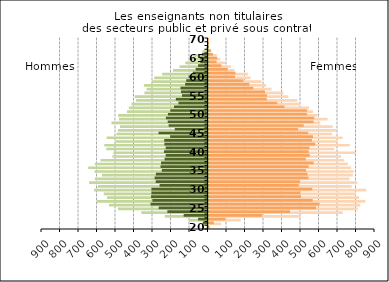
| Category | Femmes public | Femmes privé |
|---|---|---|
| 20.0 | 10 | 2 |
| 21.0 | 68 | 29 |
| 22.0 | 174 | 91 |
| 23.0 | 499 | 290 |
| 24.0 | 725 | 441 |
| 25.0 | 806 | 582 |
| 26.0 | 820 | 600 |
| 27.0 | 848 | 563 |
| 28.0 | 814 | 500 |
| 29.0 | 798 | 496 |
| 30.0 | 853 | 561 |
| 31.0 | 774 | 488 |
| 32.0 | 805 | 494 |
| 33.0 | 762 | 540 |
| 34.0 | 780 | 535 |
| 35.0 | 785 | 527 |
| 36.0 | 771 | 541 |
| 37.0 | 753 | 568 |
| 38.0 | 734 | 526 |
| 39.0 | 717 | 547 |
| 40.0 | 792 | 542 |
| 41.0 | 679 | 546 |
| 42.0 | 763 | 577 |
| 43.0 | 696 | 559 |
| 44.0 | 725 | 565 |
| 45.0 | 668 | 539 |
| 46.0 | 692 | 485 |
| 47.0 | 671 | 515 |
| 48.0 | 604 | 568 |
| 49.0 | 644 | 572 |
| 50.0 | 589 | 533 |
| 51.0 | 565 | 533 |
| 52.0 | 544 | 411 |
| 53.0 | 495 | 372 |
| 54.0 | 480 | 315 |
| 55.0 | 432 | 316 |
| 56.0 | 405 | 305 |
| 57.0 | 341 | 242 |
| 58.0 | 311 | 221 |
| 59.0 | 286 | 188 |
| 60.0 | 227 | 143 |
| 61.0 | 213 | 146 |
| 62.0 | 140 | 104 |
| 63.0 | 120 | 69 |
| 64.0 | 89 | 43 |
| 65.0 | 64 | 47 |
| 66.0 | 44 | 24 |
| 67.0 | 11 | 14 |
| 68.0 | 4 | 2 |
| 69.0 | 2 | 1 |
| 70.0 | 1 | 3 |